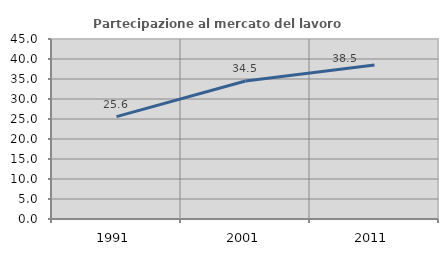
| Category | Partecipazione al mercato del lavoro  femminile |
|---|---|
| 1991.0 | 25.592 |
| 2001.0 | 34.508 |
| 2011.0 | 38.477 |